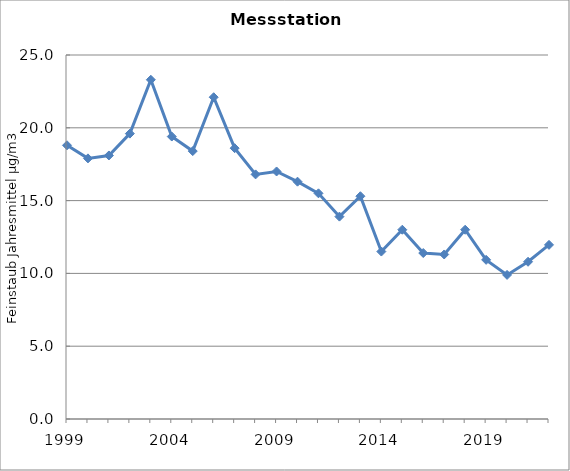
| Category | Series 0 |
|---|---|
| 1999.0 | 18.8 |
| 2000.0 | 17.9 |
| 2001.0 | 18.1 |
| 2002.0 | 19.6 |
| 2003.0 | 23.3 |
| 2004.0 | 19.4 |
| 2005.0 | 18.4 |
| 2006.0 | 22.1 |
| 2007.0 | 18.6 |
| 2008.0 | 16.8 |
| 2009.0 | 17 |
| 2010.0 | 16.3 |
| 2011.0 | 15.5 |
| 2012.0 | 13.9 |
| 2013.0 | 15.3 |
| 2014.0 | 11.5 |
| 2015.0 | 13 |
| 2016.0 | 11.4 |
| 2017.0 | 11.3 |
| 2018.0 | 13 |
| 2019.0 | 10.93 |
| 2020.0 | 9.897 |
| 2021.0 | 10.8 |
| 2022.0 | 11.96 |